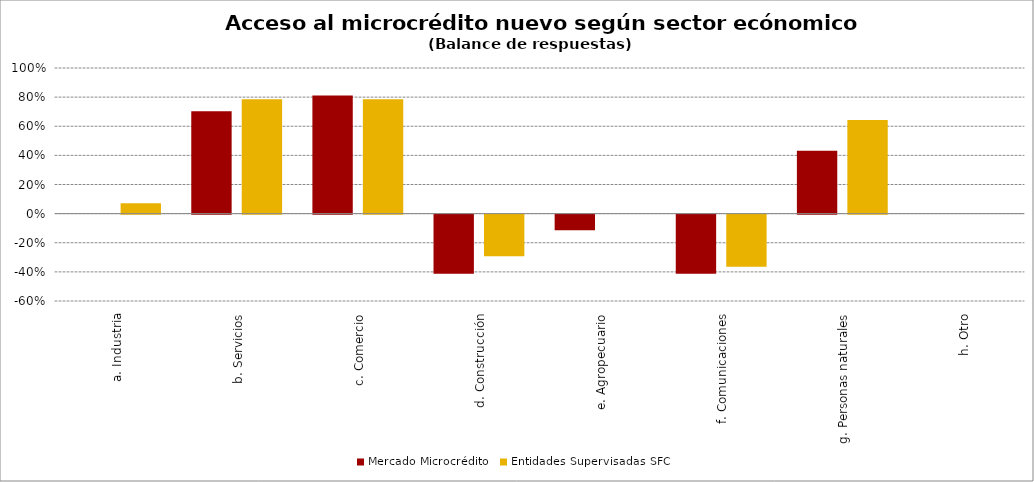
| Category | Mercado Microcrédito | Entidades Supervisadas SFC |
|---|---|---|
| a. Industria | 0 | 0.071 |
| b. Servicios | 0.703 | 0.786 |
| c. Comercio | 0.811 | 0.786 |
| d. Construcción | -0.405 | -0.286 |
| e. Agropecuario | -0.108 | 0 |
| f. Comunicaciones | -0.405 | -0.357 |
| g. Personas naturales | 0.432 | 0.643 |
| h. Otro | 0 | 0 |